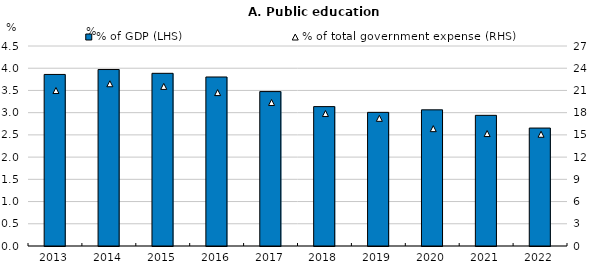
| Category | % of GDP (LHS) |
|---|---|
| 2013.0 | 3.86 |
| 2014.0 | 3.971 |
| 2015.0 | 3.885 |
| 2016.0 | 3.803 |
| 2017.0 | 3.474 |
| 2018.0 | 3.136 |
| 2019.0 | 3.007 |
| 2020.0 | 3.064 |
| 2021.0 | 2.94 |
| 2022.0 | 2.654 |